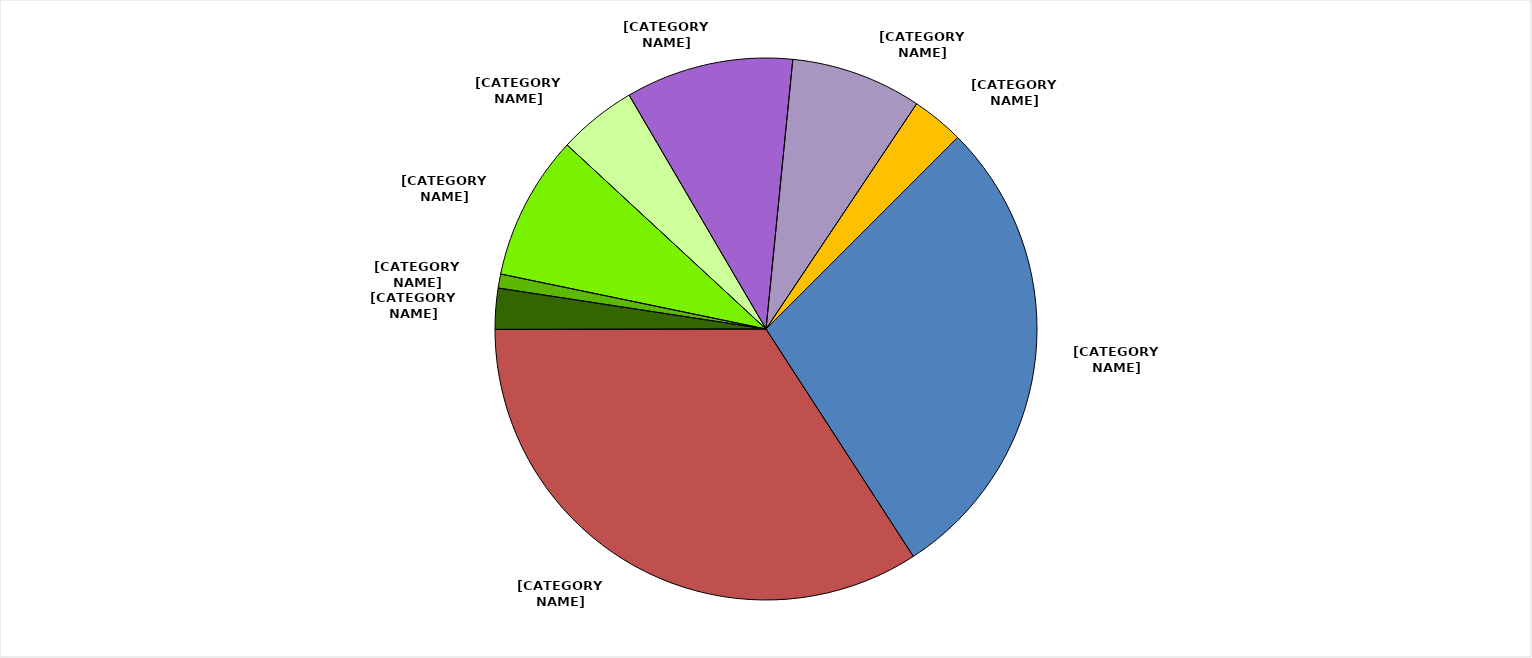
| Category | Series 0 |
|---|---|
| Local Government Contributions | 0.283 |
| Licenses, Permits & Fees | 0.341 |
| State from DOH | 0.024 |
| Foundational Public Health Services | 0.008 |
| County Public Health Assistance | 0.086 |
| State from Other | 0.047 |
| Federal through DOH | 0.1 |
| Federal from Other | 0.078 |
| Misc/Fund Balance/Other | 0.031 |